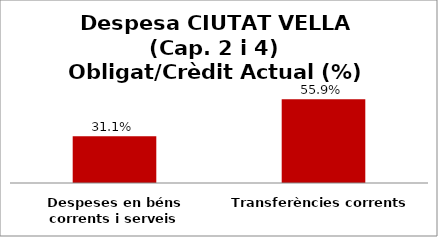
| Category | Series 0 |
|---|---|
| Despeses en béns corrents i serveis | 0.311 |
| Transferències corrents | 0.559 |